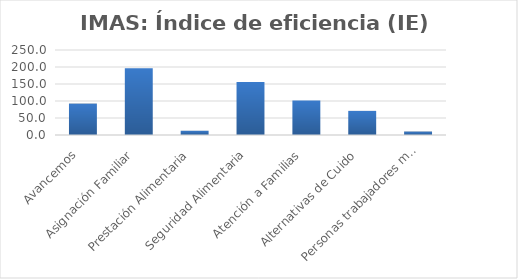
| Category | Índice de eficiencia (IE)  |
|---|---|
| Avancemos | 92.369 |
| Asignación Familiar | 196.049 |
| Prestación Alimentaria | 12.489 |
| Seguridad Alimentaria | 155.59 |
| Atención a Familias | 101.687 |
| Alternativas de Cuido | 70.937 |
| Personas trabajadores menores de edad | 10.206 |